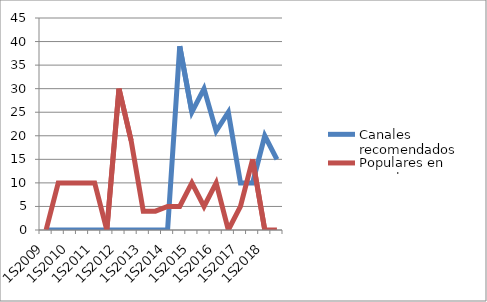
| Category | Canales recomendados | Populares en Youtube |
|---|---|---|
| 1S2009 | 0 | 0 |
| 2S2009 | 0 | 10 |
| 1S2010 | 0 | 10 |
| 2S2010 | 0 | 10 |
| 1S2011 | 0 | 10 |
| 2S2011 | 0 | 0 |
| 1S2012 | 0 | 30 |
| 2S2012 | 0 | 19 |
| 1S2013 | 0 | 4 |
| 2S2013 | 0 | 4 |
| 1S2014 | 0 | 5 |
| 2S2014 | 39 | 5 |
| 1S2015 | 25 | 10 |
| 2S2015 | 30 | 5 |
| 1S2016 | 21 | 10 |
| 2S2016 | 25 | 0 |
| 1S2017 | 10 | 5 |
| 2S2017 | 10 | 15 |
| 1S2018 | 20 | 0 |
| 2S2018 | 15 | 0 |